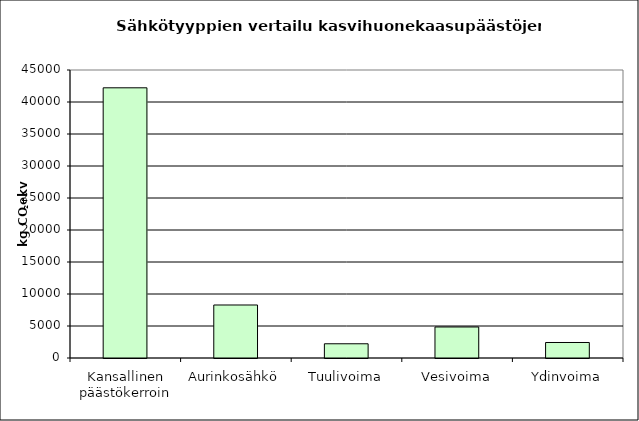
| Category | Series 1 |
|---|---|
| Kansallinen päästökerroin | 42218 |
| Aurinkosähkö | 8282 |
| Tuulivoima | 2222 |
| Vesivoima | 4848 |
| Ydinvoima | 2424 |